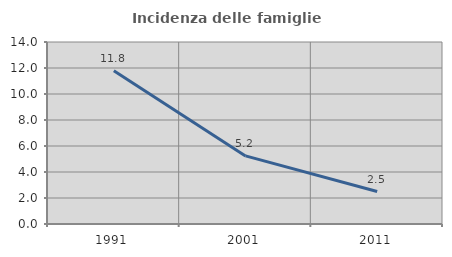
| Category | Incidenza delle famiglie numerose |
|---|---|
| 1991.0 | 11.784 |
| 2001.0 | 5.238 |
| 2011.0 | 2.495 |